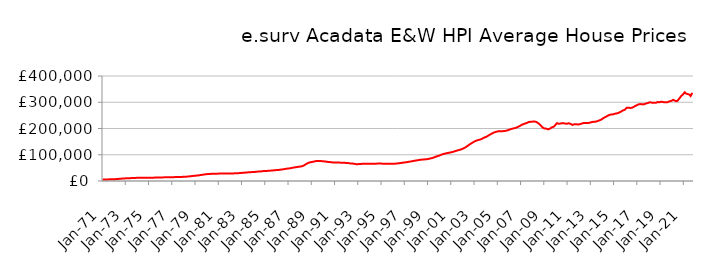
| Category | Series 0 |
|---|---|
| 1971-01-01 | 5721.637 |
| 1971-02-01 | 5762.296 |
| 1971-03-01 | 5803.295 |
| 1971-04-01 | 5856.6 |
| 1971-05-01 | 5945.059 |
| 1971-06-01 | 6037.239 |
| 1971-07-01 | 6150.593 |
| 1971-08-01 | 6273.935 |
| 1971-09-01 | 6396.293 |
| 1971-10-01 | 6523.41 |
| 1971-11-01 | 6660.635 |
| 1971-12-01 | 6827.73 |
| 1972-01-01 | 6943.709 |
| 1972-02-01 | 7019.642 |
| 1972-03-01 | 7192.485 |
| 1972-04-01 | 7434.182 |
| 1972-05-01 | 7783.4 |
| 1972-06-01 | 8089.841 |
| 1972-07-01 | 8442.17 |
| 1972-08-01 | 8782.047 |
| 1972-09-01 | 9082.157 |
| 1972-10-01 | 9362.629 |
| 1972-11-01 | 9622.344 |
| 1972-12-01 | 9890.271 |
| 1973-01-01 | 10081.941 |
| 1973-02-01 | 10217.371 |
| 1973-03-01 | 10373.062 |
| 1973-04-01 | 10550.653 |
| 1973-05-01 | 10778.346 |
| 1973-06-01 | 10926.279 |
| 1973-07-01 | 11081.212 |
| 1973-08-01 | 11253.08 |
| 1973-09-01 | 11453.654 |
| 1973-10-01 | 11661.609 |
| 1973-11-01 | 11820.086 |
| 1973-12-01 | 11933.729 |
| 1974-01-01 | 11994.68 |
| 1974-02-01 | 12060.371 |
| 1974-03-01 | 12057.68 |
| 1974-04-01 | 12031.652 |
| 1974-05-01 | 12008.684 |
| 1974-06-01 | 12009.52 |
| 1974-07-01 | 12021.199 |
| 1974-08-01 | 12060.402 |
| 1974-09-01 | 12131.717 |
| 1974-10-01 | 12219.316 |
| 1974-11-01 | 12291.911 |
| 1974-12-01 | 12363.582 |
| 1975-01-01 | 12396.74 |
| 1975-02-01 | 12438.568 |
| 1975-03-01 | 12512.8 |
| 1975-04-01 | 12618.502 |
| 1975-05-01 | 12746.827 |
| 1975-06-01 | 12815.529 |
| 1975-07-01 | 12882.897 |
| 1975-08-01 | 12975.913 |
| 1975-09-01 | 13101.794 |
| 1975-10-01 | 13241.651 |
| 1975-11-01 | 13364.792 |
| 1975-12-01 | 13496.487 |
| 1976-01-01 | 13589.21 |
| 1976-02-01 | 13676.529 |
| 1976-03-01 | 13736.277 |
| 1976-04-01 | 13799.828 |
| 1976-05-01 | 13882.974 |
| 1976-06-01 | 13937.373 |
| 1976-07-01 | 13997.548 |
| 1976-08-01 | 14086.604 |
| 1976-09-01 | 14214.053 |
| 1976-10-01 | 14357.689 |
| 1976-11-01 | 14472.621 |
| 1976-12-01 | 14575.256 |
| 1977-01-01 | 14632.325 |
| 1977-02-01 | 14697.865 |
| 1977-03-01 | 14740.363 |
| 1977-04-01 | 14790.21 |
| 1977-05-01 | 14867.201 |
| 1977-06-01 | 14937.016 |
| 1977-07-01 | 15022.857 |
| 1977-08-01 | 15140.588 |
| 1977-09-01 | 15284.567 |
| 1977-10-01 | 15446.76 |
| 1977-11-01 | 15618.347 |
| 1977-12-01 | 15842.314 |
| 1978-01-01 | 16008.634 |
| 1978-02-01 | 16138.444 |
| 1978-03-01 | 16313.376 |
| 1978-04-01 | 16548.702 |
| 1978-05-01 | 16925.958 |
| 1978-06-01 | 17307.721 |
| 1978-07-01 | 17769.442 |
| 1978-08-01 | 18243.045 |
| 1978-09-01 | 18698.842 |
| 1978-10-01 | 19152.07 |
| 1978-11-01 | 19574.7 |
| 1978-12-01 | 19992.283 |
| 1979-01-01 | 20240.686 |
| 1979-02-01 | 20407.294 |
| 1979-03-01 | 20822.308 |
| 1979-04-01 | 21391.186 |
| 1979-05-01 | 22117.161 |
| 1979-06-01 | 22577.858 |
| 1979-07-01 | 23056.032 |
| 1979-08-01 | 23594.497 |
| 1979-09-01 | 24239.606 |
| 1979-10-01 | 24928.227 |
| 1979-11-01 | 25501.578 |
| 1979-12-01 | 25947.078 |
| 1980-01-01 | 26191.666 |
| 1980-02-01 | 26381.777 |
| 1980-03-01 | 26625.705 |
| 1980-04-01 | 26911.328 |
| 1980-05-01 | 27245.442 |
| 1980-06-01 | 27424.169 |
| 1980-07-01 | 27586.236 |
| 1980-08-01 | 27736.009 |
| 1980-09-01 | 27841.614 |
| 1980-10-01 | 27909.24 |
| 1980-11-01 | 27961.216 |
| 1980-12-01 | 28071.794 |
| 1981-01-01 | 28137.528 |
| 1981-02-01 | 28237.242 |
| 1981-03-01 | 28337.226 |
| 1981-04-01 | 28471.422 |
| 1981-05-01 | 28607.481 |
| 1981-06-01 | 28653.642 |
| 1981-07-01 | 28675.655 |
| 1981-08-01 | 28681.095 |
| 1981-09-01 | 28627.074 |
| 1981-10-01 | 28528.492 |
| 1981-11-01 | 28437.987 |
| 1981-12-01 | 28428.134 |
| 1982-01-01 | 28384.207 |
| 1982-02-01 | 28403.446 |
| 1982-03-01 | 28560.962 |
| 1982-04-01 | 28826.348 |
| 1982-05-01 | 29123.624 |
| 1982-06-01 | 29232.109 |
| 1982-07-01 | 29313.958 |
| 1982-08-01 | 29470.039 |
| 1982-09-01 | 29723.125 |
| 1982-10-01 | 30023.812 |
| 1982-11-01 | 30323.377 |
| 1982-12-01 | 30694.881 |
| 1983-01-01 | 30977.174 |
| 1983-02-01 | 31219.783 |
| 1983-03-01 | 31472.577 |
| 1983-04-01 | 31785.86 |
| 1983-05-01 | 32196.746 |
| 1983-06-01 | 32519.187 |
| 1983-07-01 | 32870.27 |
| 1983-08-01 | 33203.815 |
| 1983-09-01 | 33470.441 |
| 1983-10-01 | 33688.574 |
| 1983-11-01 | 33894.414 |
| 1983-12-01 | 34164.762 |
| 1984-01-01 | 34326.341 |
| 1984-02-01 | 34490.39 |
| 1984-03-01 | 34801.858 |
| 1984-04-01 | 35233.922 |
| 1984-05-01 | 35728.512 |
| 1984-06-01 | 35947.792 |
| 1984-07-01 | 36131.309 |
| 1984-08-01 | 36410.916 |
| 1984-09-01 | 36857.095 |
| 1984-10-01 | 37373.309 |
| 1984-11-01 | 37772.28 |
| 1984-12-01 | 38049.568 |
| 1985-01-01 | 38126.541 |
| 1985-02-01 | 38232.92 |
| 1985-03-01 | 38494.448 |
| 1985-04-01 | 38861.795 |
| 1985-05-01 | 39281.243 |
| 1985-06-01 | 39443.336 |
| 1985-07-01 | 39593.189 |
| 1985-08-01 | 39852.962 |
| 1985-09-01 | 40286.193 |
| 1985-10-01 | 40780.974 |
| 1985-11-01 | 41196.83 |
| 1985-12-01 | 41529.429 |
| 1986-01-01 | 41658.708 |
| 1986-02-01 | 41790.707 |
| 1986-03-01 | 42176.28 |
| 1986-04-01 | 42734.024 |
| 1986-05-01 | 43430.153 |
| 1986-06-01 | 43851.604 |
| 1986-07-01 | 44282.443 |
| 1986-08-01 | 44796.764 |
| 1986-09-01 | 45443.204 |
| 1986-10-01 | 46141.317 |
| 1986-11-01 | 46774.998 |
| 1986-12-01 | 47365.819 |
| 1987-01-01 | 47708.6 |
| 1987-02-01 | 47992.425 |
| 1987-03-01 | 48608.074 |
| 1987-04-01 | 49436.983 |
| 1987-05-01 | 50427.396 |
| 1987-06-01 | 50986.248 |
| 1987-07-01 | 51520.875 |
| 1987-08-01 | 52109.244 |
| 1987-09-01 | 52747.907 |
| 1987-10-01 | 53409.041 |
| 1987-11-01 | 54028.462 |
| 1987-12-01 | 54670.064 |
| 1988-01-01 | 54975.068 |
| 1988-02-01 | 55238.121 |
| 1988-03-01 | 56158.153 |
| 1988-04-01 | 57542.733 |
| 1988-05-01 | 59626.022 |
| 1988-06-01 | 61728.232 |
| 1988-07-01 | 64203.536 |
| 1988-08-01 | 66480.514 |
| 1988-09-01 | 68233.782 |
| 1988-10-01 | 69689.501 |
| 1988-11-01 | 70860.28 |
| 1988-12-01 | 71899.755 |
| 1989-01-01 | 72443.122 |
| 1989-02-01 | 72902.486 |
| 1989-03-01 | 73682.173 |
| 1989-04-01 | 74674.86 |
| 1989-05-01 | 75726.533 |
| 1989-06-01 | 76186.029 |
| 1989-07-01 | 76498.876 |
| 1989-08-01 | 76645.547 |
| 1989-09-01 | 76519.1 |
| 1989-10-01 | 76165.266 |
| 1989-11-01 | 75694.544 |
| 1989-12-01 | 75310.879 |
| 1990-01-01 | 74965.571 |
| 1990-02-01 | 74951.401 |
| 1990-03-01 | 74436.887 |
| 1990-04-01 | 73769.099 |
| 1990-05-01 | 72988.276 |
| 1990-06-01 | 72615.68 |
| 1990-07-01 | 72298.179 |
| 1990-08-01 | 71988.705 |
| 1990-09-01 | 71553.822 |
| 1990-10-01 | 71056.748 |
| 1990-11-01 | 70595.419 |
| 1990-12-01 | 70399.45 |
| 1991-01-01 | 70261.691 |
| 1991-02-01 | 70335.512 |
| 1991-03-01 | 70223.689 |
| 1991-04-01 | 70149.821 |
| 1991-05-01 | 70052.594 |
| 1991-06-01 | 70009.084 |
| 1991-07-01 | 69962.851 |
| 1991-08-01 | 69897.993 |
| 1991-09-01 | 69786.979 |
| 1991-10-01 | 69588.396 |
| 1991-11-01 | 69263.131 |
| 1991-12-01 | 68919.119 |
| 1992-01-01 | 68578.405 |
| 1992-02-01 | 68526.157 |
| 1992-03-01 | 68048.234 |
| 1992-04-01 | 67471.368 |
| 1992-05-01 | 66834.583 |
| 1992-06-01 | 66626.137 |
| 1992-07-01 | 66476.266 |
| 1992-08-01 | 66161.735 |
| 1992-09-01 | 65490.411 |
| 1992-10-01 | 64657.436 |
| 1992-11-01 | 64092.776 |
| 1992-12-01 | 64109.213 |
| 1993-01-01 | 64267.822 |
| 1993-02-01 | 64548.5 |
| 1993-03-01 | 64800.703 |
| 1993-04-01 | 65116.213 |
| 1993-05-01 | 65385.205 |
| 1993-06-01 | 65415.975 |
| 1993-07-01 | 65435.438 |
| 1993-08-01 | 65489.316 |
| 1993-09-01 | 65448.33 |
| 1993-10-01 | 65330.402 |
| 1993-11-01 | 65253.231 |
| 1993-12-01 | 65481.666 |
| 1994-01-01 | 65795.911 |
| 1994-02-01 | 66187.658 |
| 1994-03-01 | 66172.726 |
| 1994-04-01 | 66012.999 |
| 1994-05-01 | 65872.726 |
| 1994-06-01 | 65885.299 |
| 1994-07-01 | 65964.465 |
| 1994-08-01 | 66127.292 |
| 1994-09-01 | 66386.103 |
| 1994-10-01 | 66699.652 |
| 1994-11-01 | 66848.045 |
| 1994-12-01 | 66760.501 |
| 1995-01-01 | 66271.317 |
| 1995-02-01 | 65850.218 |
| 1995-03-01 | 65691.881 |
| 1995-04-01 | 65526.898 |
| 1995-05-01 | 65554.846 |
| 1995-06-01 | 65415.772 |
| 1995-07-01 | 65558.368 |
| 1995-08-01 | 65621.703 |
| 1995-09-01 | 65659.154 |
| 1995-10-01 | 65635.619 |
| 1995-11-01 | 65718.381 |
| 1995-12-01 | 65799.005 |
| 1996-01-01 | 65822.874 |
| 1996-02-01 | 65782.824 |
| 1996-03-01 | 66000.184 |
| 1996-04-01 | 66256.695 |
| 1996-05-01 | 66744.04 |
| 1996-06-01 | 67100.794 |
| 1996-07-01 | 67683.378 |
| 1996-08-01 | 68247.062 |
| 1996-09-01 | 68816.57 |
| 1996-10-01 | 69231.247 |
| 1996-11-01 | 69670.904 |
| 1996-12-01 | 70292.598 |
| 1997-01-01 | 70738.527 |
| 1997-02-01 | 71213.588 |
| 1997-03-01 | 71619.33 |
| 1997-04-01 | 72277.827 |
| 1997-05-01 | 73137.953 |
| 1997-06-01 | 73791.083 |
| 1997-07-01 | 74252.184 |
| 1997-08-01 | 74987.177 |
| 1997-09-01 | 75644.772 |
| 1997-10-01 | 76496.497 |
| 1997-11-01 | 77092.068 |
| 1997-12-01 | 77848.446 |
| 1998-01-01 | 78297.188 |
| 1998-02-01 | 78971.066 |
| 1998-03-01 | 79558.894 |
| 1998-04-01 | 80288.676 |
| 1998-05-01 | 80807.089 |
| 1998-06-01 | 81125.572 |
| 1998-07-01 | 81506.943 |
| 1998-08-01 | 81863.791 |
| 1998-09-01 | 82224.992 |
| 1998-10-01 | 82464.657 |
| 1998-11-01 | 82744.276 |
| 1998-12-01 | 83080.436 |
| 1999-01-01 | 83577.993 |
| 1999-02-01 | 84571.705 |
| 1999-03-01 | 85447.682 |
| 1999-04-01 | 86316.681 |
| 1999-05-01 | 87268.309 |
| 1999-06-01 | 88275.026 |
| 1999-07-01 | 89460.227 |
| 1999-08-01 | 90994.233 |
| 1999-09-01 | 92557.97 |
| 1999-10-01 | 93994.71 |
| 1999-11-01 | 94970.284 |
| 1999-12-01 | 96280.655 |
| 2000-01-01 | 97325.701 |
| 2000-02-01 | 99209.663 |
| 2000-03-01 | 100688.495 |
| 2000-04-01 | 102265.077 |
| 2000-05-01 | 103063.262 |
| 2000-06-01 | 104041.767 |
| 2000-07-01 | 104914.739 |
| 2000-08-01 | 105728.177 |
| 2000-09-01 | 106483.482 |
| 2000-10-01 | 107259.346 |
| 2000-11-01 | 107898.373 |
| 2000-12-01 | 108711.995 |
| 2001-01-01 | 109371.114 |
| 2001-02-01 | 110393.728 |
| 2001-03-01 | 111350.355 |
| 2001-04-01 | 112525.531 |
| 2001-05-01 | 113793.316 |
| 2001-06-01 | 114844.266 |
| 2001-07-01 | 115990.605 |
| 2001-08-01 | 117133.207 |
| 2001-09-01 | 118167.979 |
| 2001-10-01 | 118862.601 |
| 2001-11-01 | 120047.789 |
| 2001-12-01 | 121360.722 |
| 2002-01-01 | 123114.809 |
| 2002-02-01 | 124819.005 |
| 2002-03-01 | 126855.333 |
| 2002-04-01 | 129047.909 |
| 2002-05-01 | 131523.479 |
| 2002-06-01 | 134030.721 |
| 2002-07-01 | 136776.102 |
| 2002-08-01 | 139215.035 |
| 2002-09-01 | 141803.563 |
| 2002-10-01 | 144227.825 |
| 2002-11-01 | 146357.451 |
| 2002-12-01 | 148702.365 |
| 2003-01-01 | 150794.009 |
| 2003-02-01 | 152510.864 |
| 2003-03-01 | 153898.607 |
| 2003-04-01 | 155226.269 |
| 2003-05-01 | 156353.205 |
| 2003-06-01 | 157259.237 |
| 2003-07-01 | 158057.815 |
| 2003-08-01 | 159627.899 |
| 2003-09-01 | 161267.535 |
| 2003-10-01 | 163410.624 |
| 2003-11-01 | 165491.163 |
| 2003-12-01 | 167233.597 |
| 2004-01-01 | 167957.067 |
| 2004-02-01 | 170238.124 |
| 2004-03-01 | 172480.568 |
| 2004-04-01 | 174513.653 |
| 2004-05-01 | 176743.804 |
| 2004-06-01 | 178895.701 |
| 2004-07-01 | 180975.64 |
| 2004-08-01 | 183049.298 |
| 2004-09-01 | 184672.192 |
| 2004-10-01 | 186320.382 |
| 2004-11-01 | 187184.644 |
| 2004-12-01 | 188206.909 |
| 2005-01-01 | 189021.112 |
| 2005-02-01 | 190183.952 |
| 2005-03-01 | 190005.817 |
| 2005-04-01 | 190071.875 |
| 2005-05-01 | 189485.539 |
| 2005-06-01 | 190073.366 |
| 2005-07-01 | 190099.846 |
| 2005-08-01 | 190409.416 |
| 2005-09-01 | 191025.705 |
| 2005-10-01 | 192128.229 |
| 2005-11-01 | 193022.749 |
| 2005-12-01 | 194589.472 |
| 2006-01-01 | 195561.889 |
| 2006-02-01 | 197180.233 |
| 2006-03-01 | 198290.018 |
| 2006-04-01 | 199521.21 |
| 2006-05-01 | 200291.878 |
| 2006-06-01 | 200874.24 |
| 2006-07-01 | 201753.772 |
| 2006-08-01 | 202945.476 |
| 2006-09-01 | 204665.909 |
| 2006-10-01 | 206669.853 |
| 2006-11-01 | 208271.992 |
| 2006-12-01 | 210431.706 |
| 2007-01-01 | 212236.573 |
| 2007-02-01 | 214691.924 |
| 2007-03-01 | 215960.598 |
| 2007-04-01 | 217668.208 |
| 2007-05-01 | 218745.526 |
| 2007-06-01 | 220436.757 |
| 2007-07-01 | 221128.98 |
| 2007-08-01 | 222903.284 |
| 2007-09-01 | 224639.27 |
| 2007-10-01 | 225909.983 |
| 2007-11-01 | 225637.65 |
| 2007-12-01 | 225795.991 |
| 2008-01-01 | 226230.744 |
| 2008-02-01 | 227150.677 |
| 2008-03-01 | 226536.237 |
| 2008-04-01 | 226088.749 |
| 2008-05-01 | 224583.894 |
| 2008-06-01 | 222870.934 |
| 2008-07-01 | 219624.904 |
| 2008-08-01 | 216697.269 |
| 2008-09-01 | 213087.292 |
| 2008-10-01 | 209193.305 |
| 2008-11-01 | 204692.274 |
| 2008-12-01 | 201599.231 |
| 2009-01-01 | 200403.32 |
| 2009-02-01 | 201116.809 |
| 2009-03-01 | 199383.582 |
| 2009-04-01 | 198315.606 |
| 2009-05-01 | 196756.715 |
| 2009-06-01 | 198255.489 |
| 2009-07-01 | 199781.16 |
| 2009-08-01 | 202057.625 |
| 2009-09-01 | 204651.712 |
| 2009-10-01 | 206995.738 |
| 2009-11-01 | 207417.779 |
| 2009-12-01 | 211553.202 |
| 2010-01-01 | 214966.047 |
| 2010-02-01 | 220222.605 |
| 2010-03-01 | 218833.653 |
| 2010-04-01 | 218095.869 |
| 2010-05-01 | 218270.945 |
| 2010-06-01 | 219021.418 |
| 2010-07-01 | 219694.86 |
| 2010-08-01 | 220453.705 |
| 2010-09-01 | 220333.072 |
| 2010-10-01 | 219430.502 |
| 2010-11-01 | 217758.718 |
| 2010-12-01 | 217843.886 |
| 2011-01-01 | 218308.872 |
| 2011-02-01 | 219903.599 |
| 2011-03-01 | 220093.176 |
| 2011-04-01 | 217992.594 |
| 2011-05-01 | 215269.271 |
| 2011-06-01 | 213677.232 |
| 2011-07-01 | 214756.836 |
| 2011-08-01 | 216261.648 |
| 2011-09-01 | 216160.859 |
| 2011-10-01 | 216413 |
| 2011-11-01 | 215076.714 |
| 2011-12-01 | 215195.615 |
| 2012-01-01 | 215831.279 |
| 2012-02-01 | 216608.392 |
| 2012-03-01 | 218433.925 |
| 2012-04-01 | 219229.758 |
| 2012-05-01 | 221315.79 |
| 2012-06-01 | 221273.57 |
| 2012-07-01 | 221114.337 |
| 2012-08-01 | 220621.314 |
| 2012-09-01 | 220819.802 |
| 2012-10-01 | 221141.866 |
| 2012-11-01 | 221164.226 |
| 2012-12-01 | 221860.869 |
| 2013-01-01 | 222596.882 |
| 2013-02-01 | 224450.937 |
| 2013-03-01 | 225296.589 |
| 2013-04-01 | 225849.652 |
| 2013-05-01 | 225718.614 |
| 2013-06-01 | 226002.925 |
| 2013-07-01 | 226930.605 |
| 2013-08-01 | 228408.536 |
| 2013-09-01 | 229824.697 |
| 2013-10-01 | 231209.99 |
| 2013-11-01 | 232088.932 |
| 2013-12-01 | 234238.428 |
| 2014-01-01 | 237365.145 |
| 2014-02-01 | 239694.72 |
| 2014-03-01 | 242055.681 |
| 2014-04-01 | 243338.29 |
| 2014-05-01 | 245816.756 |
| 2014-06-01 | 247723.782 |
| 2014-07-01 | 249499.817 |
| 2014-08-01 | 251313.134 |
| 2014-09-01 | 252749.811 |
| 2014-10-01 | 253554.587 |
| 2014-11-01 | 253513.511 |
| 2014-12-01 | 253886.163 |
| 2015-01-01 | 255260.291 |
| 2015-02-01 | 256442.252 |
| 2015-03-01 | 257148.908 |
| 2015-04-01 | 257702.233 |
| 2015-05-01 | 258891.89 |
| 2015-06-01 | 260266.761 |
| 2015-07-01 | 261578.962 |
| 2015-08-01 | 264001.261 |
| 2015-09-01 | 265964.492 |
| 2015-10-01 | 268628.509 |
| 2015-11-01 | 269111.396 |
| 2015-12-01 | 271150.763 |
| 2016-01-01 | 273132.57 |
| 2016-02-01 | 278749.158 |
| 2016-03-01 | 279015.252 |
| 2016-04-01 | 279083.931 |
| 2016-05-01 | 277191.159 |
| 2016-06-01 | 278300.659 |
| 2016-07-01 | 278735.279 |
| 2016-08-01 | 279550.537 |
| 2016-09-01 | 281143.525 |
| 2016-10-01 | 283844.145 |
| 2016-11-01 | 285456.064 |
| 2016-12-01 | 287658.857 |
| 2017-01-01 | 289822.876 |
| 2017-02-01 | 291690.019 |
| 2017-03-01 | 293217.574 |
| 2017-04-01 | 293135.305 |
| 2017-05-01 | 293034.824 |
| 2017-06-01 | 291896.223 |
| 2017-07-01 | 291758.358 |
| 2017-08-01 | 292226.381 |
| 2017-09-01 | 294023.961 |
| 2017-10-01 | 295304.478 |
| 2017-11-01 | 296276.989 |
| 2017-12-01 | 297197.81 |
| 2018-01-01 | 298811.713 |
| 2018-02-01 | 300029.625 |
| 2018-03-01 | 299205.749 |
| 2018-04-01 | 298409.542 |
| 2018-05-01 | 297506.941 |
| 2018-06-01 | 297959.121 |
| 2018-07-01 | 297018.79 |
| 2018-08-01 | 297858.66 |
| 2018-09-01 | 298624.478 |
| 2018-10-01 | 300545.418 |
| 2018-11-01 | 299652.448 |
| 2018-12-01 | 300349.168 |
| 2019-01-01 | 300797.826 |
| 2019-02-01 | 302149.078 |
| 2019-03-01 | 301209.863 |
| 2019-04-01 | 300448.054 |
| 2019-05-01 | 300433.595 |
| 2019-06-01 | 300235.304 |
| 2019-07-01 | 299725.745 |
| 2019-08-01 | 299567.415 |
| 2019-09-01 | 301214.163 |
| 2019-10-01 | 303183.912 |
| 2019-11-01 | 304171.981 |
| 2019-12-01 | 305037.273 |
| 2020-01-01 | 306726.536 |
| 2020-02-01 | 309147.651 |
| 2020-03-01 | 309061.32 |
| 2020-04-01 | 305755.314 |
| 2020-05-01 | 303240.718 |
| 2020-06-01 | 303864.207 |
| 2020-07-01 | 307899.592 |
| 2020-08-01 | 312731.348 |
| 2020-09-01 | 317144.765 |
| 2020-10-01 | 322191.927 |
| 2020-11-01 | 324727.612 |
| 2020-12-01 | 329417.35 |
| 2021-01-01 | 332121.17 |
| 2021-02-01 | 338144.026 |
| 2021-03-01 | 333564.464 |
| 2021-04-01 | 330045.858 |
| 2021-05-01 | 331222.019 |
| 2021-06-01 | 328484.676 |
| 2021-07-01 | 328716.982 |
| 2021-08-01 | 323758.505 |
| 2021-09-01 | 330825.762 |
| 2021-10-01 | 335324.928 |